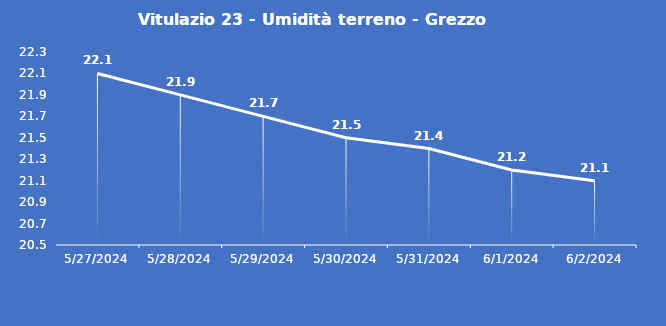
| Category | Vitulazio 23 - Umidità terreno - Grezzo (%VWC) |
|---|---|
| 5/27/24 | 22.1 |
| 5/28/24 | 21.9 |
| 5/29/24 | 21.7 |
| 5/30/24 | 21.5 |
| 5/31/24 | 21.4 |
| 6/1/24 | 21.2 |
| 6/2/24 | 21.1 |